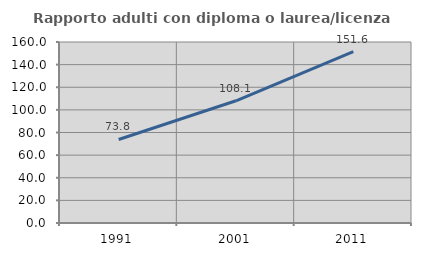
| Category | Rapporto adulti con diploma o laurea/licenza media  |
|---|---|
| 1991.0 | 73.827 |
| 2001.0 | 108.054 |
| 2011.0 | 151.56 |